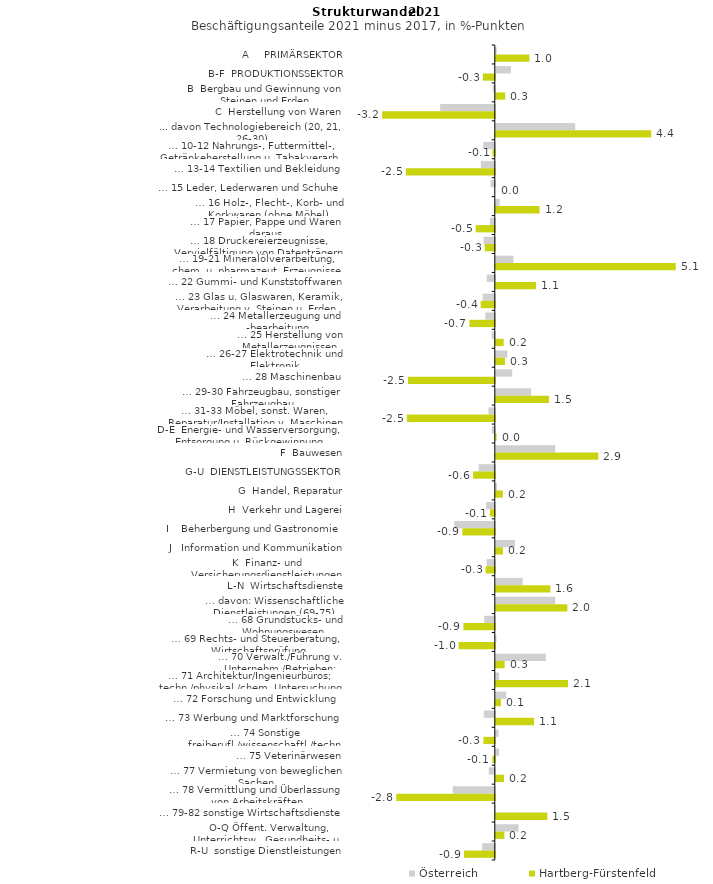
| Category | Österreich | Hartberg-Fürstenfeld |
|---|---|---|
| A     PRIMÄRSEKTOR | 0.029 | 0.956 |
| B-F  PRODUKTIONSSEKTOR | 0.429 | -0.339 |
| B  Bergbau und Gewinnung von Steinen und Erden | -0.054 | 0.27 |
| C  Herstellung von Waren | -1.552 | -3.202 |
| ... davon Technologiebereich (20, 21, 26-30) | 2.256 | 4.417 |
| … 10-12 Nahrungs-, Futtermittel-, Getränkeherstellung u. Tabakverarb. | -0.33 | -0.063 |
| … 13-14 Textilien und Bekleidung | -0.397 | -2.529 |
| … 15 Leder, Lederwaren und Schuhe | -0.119 | 0 |
| … 16 Holz-, Flecht-, Korb- und Korkwaren (ohne Möbel)  | 0.11 | 1.243 |
| … 17 Papier, Pappe und Waren daraus  | -0.136 | -0.542 |
| … 18 Druckereierzeugnisse, Vervielfältigung von Datenträgern | -0.317 | -0.286 |
| … 19-21 Mineralölverarbeitung, chem. u. pharmazeut. Erzeugnisse | 0.503 | 5.112 |
| … 22 Gummi- und Kunststoffwaren | -0.229 | 1.141 |
| … 23 Glas u. Glaswaren, Keramik, Verarbeitung v. Steinen u. Erden  | -0.345 | -0.4 |
| … 24 Metallerzeugung und -bearbeitung | -0.269 | -0.722 |
| … 25 Herstellung von Metallerzeugnissen  | -0.086 | 0.223 |
| … 26-27 Elektrotechnik und Elektronik | 0.325 | 0.258 |
| … 28 Maschinenbau | 0.465 | -2.467 |
| … 29-30 Fahrzeugbau, sonstiger Fahrzeugbau | 1.003 | 1.513 |
| … 31-33 Möbel, sonst. Waren, Reparatur/Installation v. Maschinen | -0.178 | -2.499 |
| D-E  Energie- und Wasserversorgung, Entsorgung u. Rückgewinnung | -0.083 | 0.021 |
| F  Bauwesen | 1.689 | 2.911 |
| G-U  DIENSTLEISTUNGSSEKTOR | -0.458 | -0.617 |
| G  Handel, Reparatur | 0.035 | 0.201 |
| H  Verkehr und Lagerei | -0.247 | -0.137 |
| I    Beherbergung und Gastronomie | -1.152 | -0.921 |
| J   Information und Kommunikation | 0.543 | 0.205 |
| K  Finanz- und Versicherungsdienstleistungen | -0.232 | -0.262 |
| L-N  Wirtschaftsdienste | 0.764 | 1.554 |
| … davon: Wissenschaftliche Dienstleistungen (69-75) | 1.689 | 2.033 |
| … 68 Grundstücks- und Wohnungswesen  | -0.302 | -0.89 |
| … 69 Rechts- und Steuerberatung, Wirtschaftsprüfung | 0.021 | -1.027 |
| … 70 Verwalt./Führung v. Unternehm./Betrieben; Unternehmensberat. | 1.422 | 0.25 |
| … 71 Architektur/Ingenieurbüros; techn./physikal./chem. Untersuchung | 0.093 | 2.051 |
| … 72 Forschung und Entwicklung  | 0.296 | 0.146 |
| … 73 Werbung und Marktforschung | -0.315 | 1.089 |
| … 74 Sonstige freiberufl./wissenschaftl./techn. Tätigkeiten | 0.077 | -0.324 |
| … 75 Veterinärwesen | 0.095 | -0.07 |
| … 77 Vermietung von beweglichen Sachen  | -0.17 | 0.233 |
| … 78 Vermittlung und Überlassung von Arbeitskräften | -1.195 | -2.799 |
| … 79-82 sonstige Wirtschaftsdienste | -0.022 | 1.464 |
| O-Q Öffent. Verwaltung, Unterrichtsw., Gesundheits- u. Sozialwesen | 0.646 | 0.245 |
| R-U  sonstige Dienstleistungen | -0.357 | -0.873 |